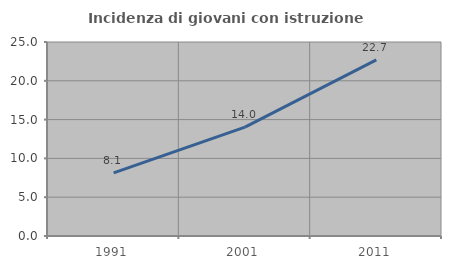
| Category | Incidenza di giovani con istruzione universitaria |
|---|---|
| 1991.0 | 8.134 |
| 2001.0 | 14.027 |
| 2011.0 | 22.703 |